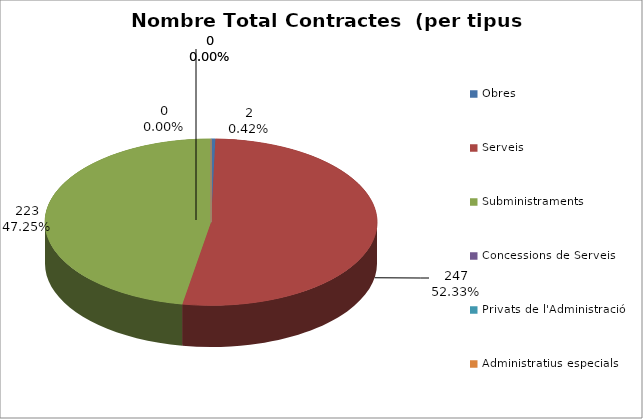
| Category | Nombre Total Contractes |
|---|---|
| Obres | 2 |
| Serveis | 247 |
| Subministraments | 223 |
| Concessions de Serveis | 0 |
| Privats de l'Administració | 0 |
| Administratius especials | 0 |